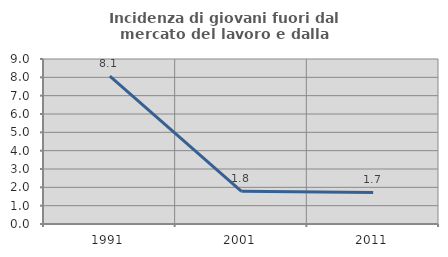
| Category | Incidenza di giovani fuori dal mercato del lavoro e dalla formazione  |
|---|---|
| 1991.0 | 8.065 |
| 2001.0 | 1.786 |
| 2011.0 | 1.724 |